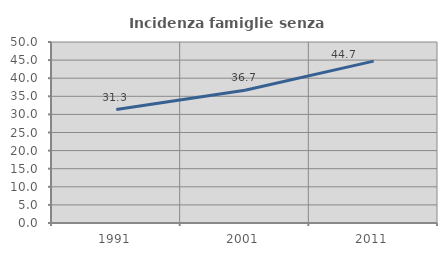
| Category | Incidenza famiglie senza nuclei |
|---|---|
| 1991.0 | 31.333 |
| 2001.0 | 36.694 |
| 2011.0 | 44.726 |